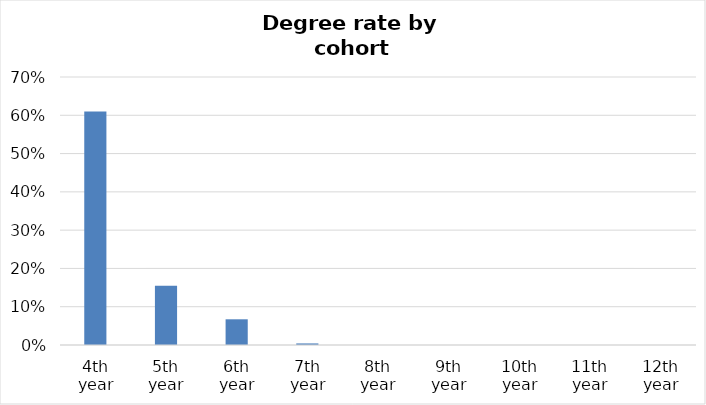
| Category | Series 0 |
|---|---|
| 4th year | 0.61 |
| 5th year | 0.155 |
| 6th year | 0.067 |
| 7th year | 0.004 |
| 8th year | 0 |
| 9th year | 0 |
| 10th year | 0 |
| 11th year | 0 |
| 12th year | 0 |